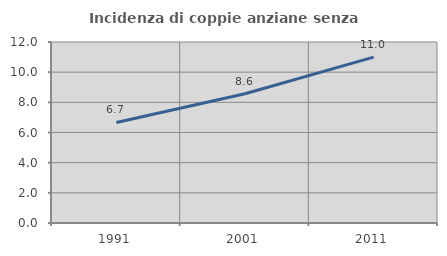
| Category | Incidenza di coppie anziane senza figli  |
|---|---|
| 1991.0 | 6.667 |
| 2001.0 | 8.566 |
| 2011.0 | 10.995 |